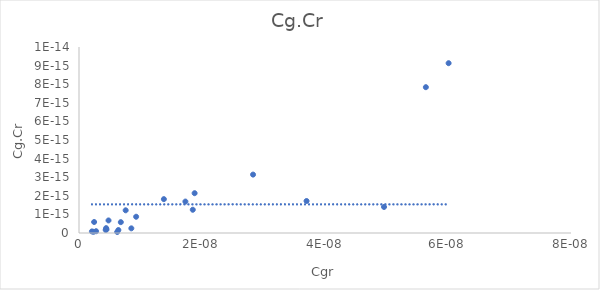
| Category | Cg.Cr |
|---|---|
| 6.21e-09 | 0 |
| 6.4e-09 | 0 |
| 2.36e-09 | 0 |
| 4.96e-08 | 0 |
| 8.51e-09 | 0 |
| 2.78e-09 | 0 |
| 4.34e-09 | 0 |
| 2.1e-09 | 0 |
| 4.47e-09 | 0 |
| 3.7e-08 | 0 |
| 4.41e-09 | 0 |
| 1.85e-08 | 0 |
| 6.8e-09 | 0 |
| 9.29e-09 | 0 |
| 1.73e-08 | 0 |
| 2.83e-08 | 0 |
| 1.88e-08 | 0 |
| 1.38e-08 | 0 |
| 5.64e-08 | 0 |
| 4.8e-09 | 0 |
| 6.01e-08 | 0 |
| 7.59e-09 | 0 |
| 2.46e-09 | 0 |